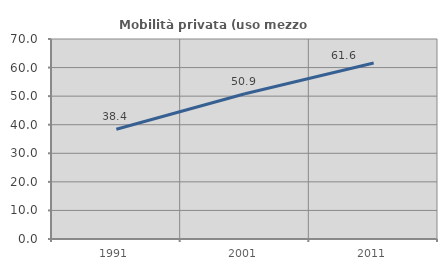
| Category | Mobilità privata (uso mezzo privato) |
|---|---|
| 1991.0 | 38.412 |
| 2001.0 | 50.858 |
| 2011.0 | 61.614 |